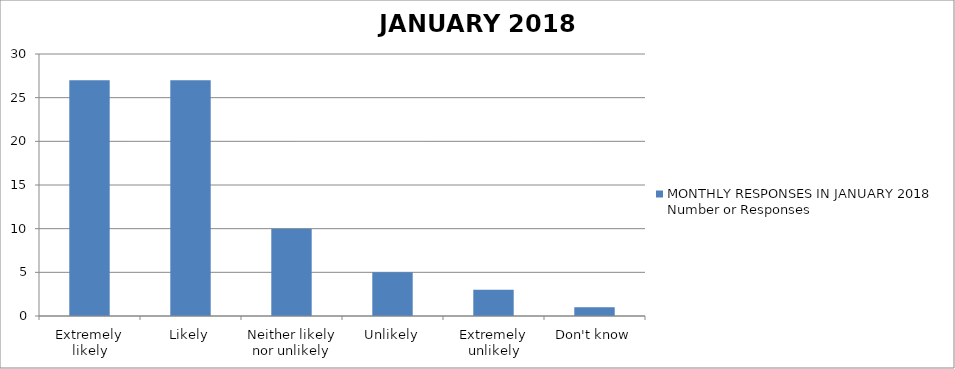
| Category | MONTHLY RESPONSES IN JANUARY 2018 |
|---|---|
| Extremely likely | 27 |
| Likely | 27 |
| Neither likely nor unlikely | 10 |
| Unlikely | 5 |
| Extremely unlikely | 3 |
| Don't know | 1 |